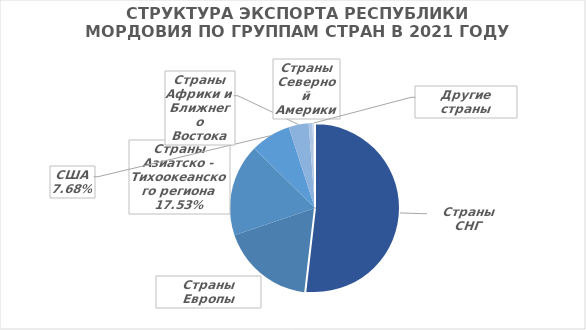
| Category | Итог |
|---|---|
| Страны СНГ | 194758.75 |
| Страны Европы | 67472.63 |
| Страны Азиатско - Тихоокеанского региона | 65867.45 |
| США | 28857.61 |
| Страны Африки и Ближнего Востока | 14291.84 |
| Страны Северной Америки | 2701.12 |
| Другие страны | 1776.31 |